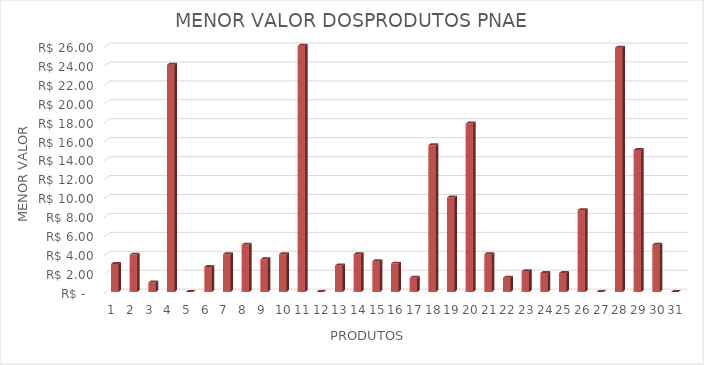
| Category | Series 0 |
|---|---|
| 0 | 2.95 |
| 1 | 3.95 |
| 2 | 1 |
| 3 | 24 |
| 4 | 0 |
| 5 | 2.65 |
| 6 | 4 |
| 7 | 4.99 |
| 8 | 3.45 |
| 9 | 4 |
| 10 | 28.6 |
| 11 | 0 |
| 12 | 2.8 |
| 13 | 4 |
| 14 | 3.25 |
| 15 | 3 |
| 16 | 1.5 |
| 17 | 15.5 |
| 18 | 9.99 |
| 19 | 17.8 |
| 20 | 4 |
| 21 | 1.5 |
| 22 | 2.2 |
| 23 | 2 |
| 24 | 2 |
| 25 | 8.65 |
| 26 | 0 |
| 27 | 25.8 |
| 28 | 15 |
| 29 | 5 |
| 30 | 0 |